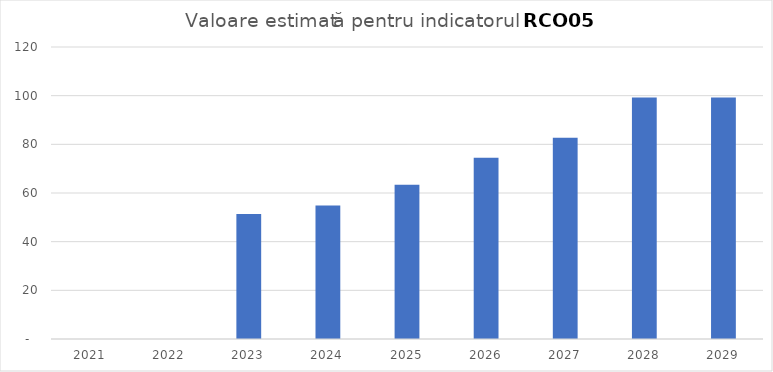
| Category | Series 0 |
|---|---|
| 2021.0 | 0 |
| 2022.0 | 0 |
| 2023.0 | 51.386 |
| 2024.0 | 54.906 |
| 2025.0 | 63.353 |
| 2026.0 | 74.439 |
| 2027.0 | 82.71 |
| 2028.0 | 99.252 |
| 2029.0 | 99.252 |